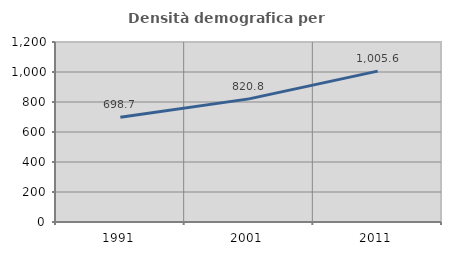
| Category | Densità demografica |
|---|---|
| 1991.0 | 698.737 |
| 2001.0 | 820.813 |
| 2011.0 | 1005.634 |